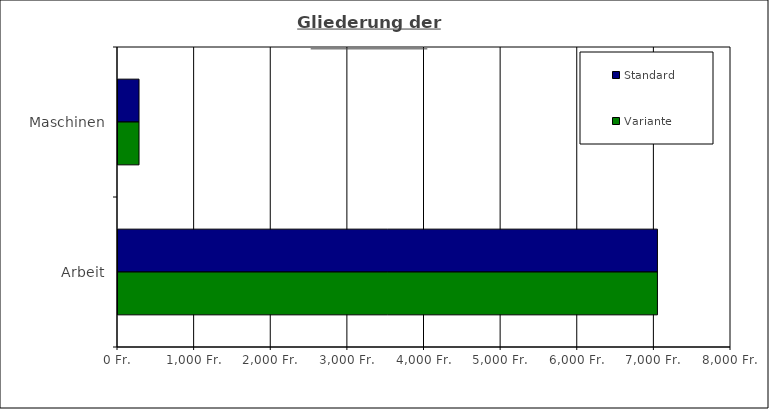
| Category | Standard | Variante  |
|---|---|---|
| Maschinen | 274.306 | 274.306 |
| Arbeit | 7039.786 | 7039.786 |